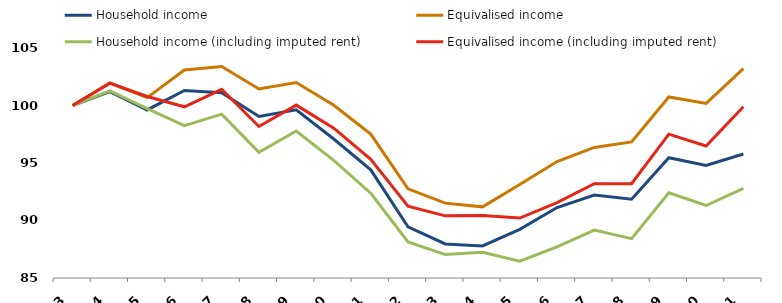
| Category | Household income  | Equivalised income  | Household income (including imputed rent)  | Equivalised income (including imputed rent)  |
|---|---|---|---|---|
| 2003.0 | 100 | 100 | 100 | 100 |
| 2004.0 | 101.21 | 101.955 | 101.266 | 101.948 |
| 2005.0 | 99.613 | 100.683 | 99.737 | 100.78 |
| 2006.0 | 101.309 | 103.087 | 98.244 | 99.886 |
| 2007.0 | 101.105 | 103.394 | 99.245 | 101.408 |
| 2008.0 | 99.044 | 101.431 | 95.932 | 98.174 |
| 2009.0 | 99.628 | 102.002 | 97.782 | 100.034 |
| 2010.0 | 97.108 | 100.039 | 95.25 | 98.046 |
| 2011.0 | 94.407 | 97.512 | 92.373 | 95.322 |
| 2012.0 | 89.446 | 92.75 | 88.138 | 91.245 |
| 2013.0 | 87.964 | 91.51 | 87.036 | 90.404 |
| 2014.0 | 87.784 | 91.186 | 87.238 | 90.44 |
| 2015.0 | 89.232 | 93.125 | 86.469 | 90.21 |
| 2016.0 | 91.129 | 95.13 | 87.704 | 91.549 |
| 2017.0 | 92.214 | 96.357 | 89.167 | 93.196 |
| 2018.0 | 91.854 | 96.831 | 88.422 | 93.198 |
| 2019.0 | 95.456 | 100.741 | 92.414 | 97.509 |
| 2020.0 | 94.793 | 100.181 | 91.304 | 96.477 |
| 2021.0 | 95.783 | 103.2 | 92.785 | 99.885 |